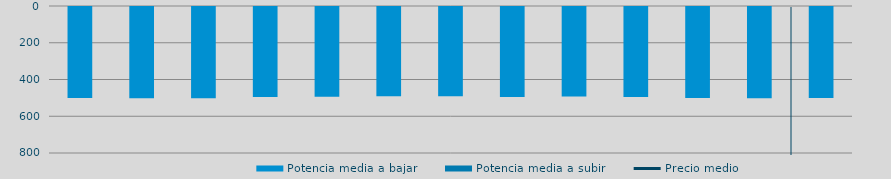
| Category | Potencia media a bajar | Potencia media a subir |
|---|---|---|
| 0 | 495.172 |  |
| 1 | 496.264 |  |
| 2 | 496.176 |  |
| 3 | 490.249 |  |
| 4 | 488.138 |  |
| 5 | 485.047 |  |
| 6 | 485.731 |  |
| 7 | 489.157 |  |
| 8 | 487.01 |  |
| 9 | 490.333 |  |
| 10 | 495.342 |  |
| 11 | 496.882 |  |
| 12 | 495.707 |  |